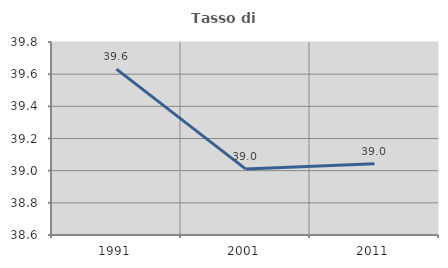
| Category | Tasso di occupazione   |
|---|---|
| 1991.0 | 39.632 |
| 2001.0 | 39.011 |
| 2011.0 | 39.043 |